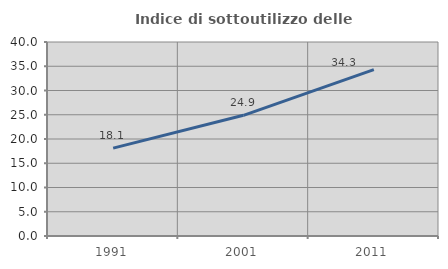
| Category | Indice di sottoutilizzo delle abitazioni  |
|---|---|
| 1991.0 | 18.127 |
| 2001.0 | 24.888 |
| 2011.0 | 34.318 |